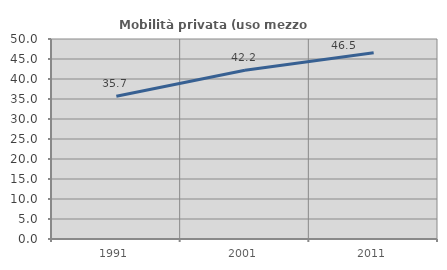
| Category | Mobilità privata (uso mezzo privato) |
|---|---|
| 1991.0 | 35.697 |
| 2001.0 | 42.202 |
| 2011.0 | 46.535 |